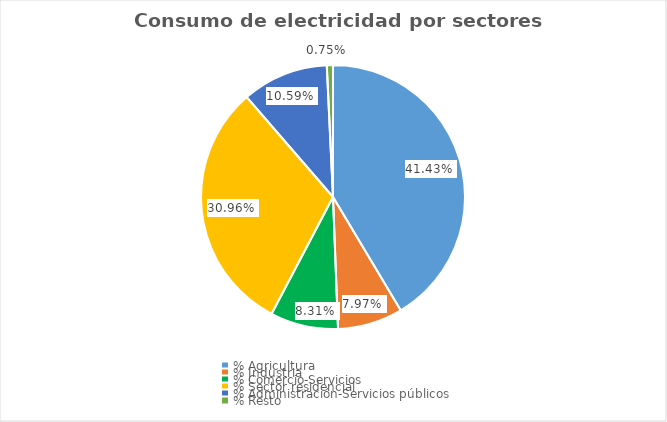
| Category | Series 0 |
|---|---|
| % Agricultura | 0.414 |
| % Industria | 0.08 |
| % Comercio-Servicios | 0.083 |
| % Sector residencial | 0.31 |
| % Administración-Servicios públicos | 0.106 |
| % Resto | 0.008 |